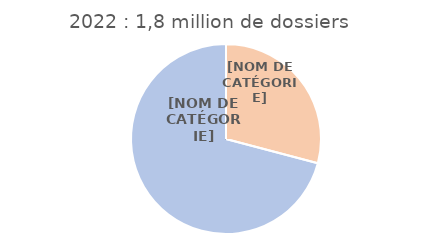
| Category | 2022 |
|---|---|
| Demandeurs d'emploi | 530000 |
| Salariés & autres | 1290000 |